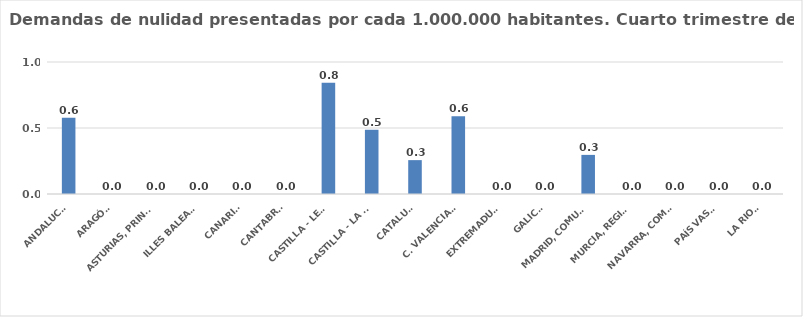
| Category | Series 0 |
|---|---|
| ANDALUCÍA | 0.577 |
| ARAGÓN | 0 |
| ASTURIAS, PRINCIPADO | 0 |
| ILLES BALEARS | 0 |
| CANARIAS | 0 |
| CANTABRIA | 0 |
| CASTILLA - LEÓN | 0.843 |
| CASTILLA - LA MANCHA | 0.487 |
| CATALUÑA | 0.257 |
| C. VALENCIANA | 0.588 |
| EXTREMADURA | 0 |
| GALICIA | 0 |
| MADRID, COMUNIDAD | 0.296 |
| MURCIA, REGIÓN | 0 |
| NAVARRA, COM. FORAL | 0 |
| PAÍS VASCO | 0 |
| LA RIOJA | 0 |